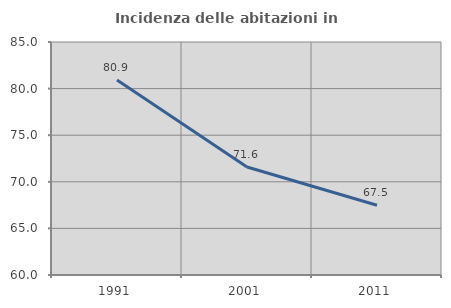
| Category | Incidenza delle abitazioni in proprietà  |
|---|---|
| 1991.0 | 80.919 |
| 2001.0 | 71.583 |
| 2011.0 | 67.487 |